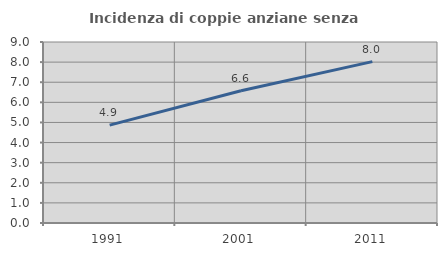
| Category | Incidenza di coppie anziane senza figli  |
|---|---|
| 1991.0 | 4.867 |
| 2001.0 | 6.579 |
| 2011.0 | 8.023 |